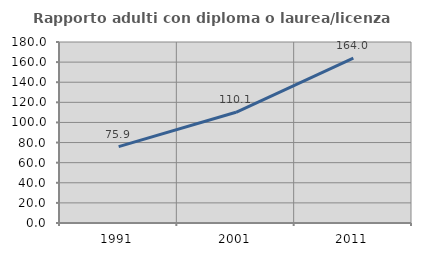
| Category | Rapporto adulti con diploma o laurea/licenza media  |
|---|---|
| 1991.0 | 75.919 |
| 2001.0 | 110.08 |
| 2011.0 | 164.037 |